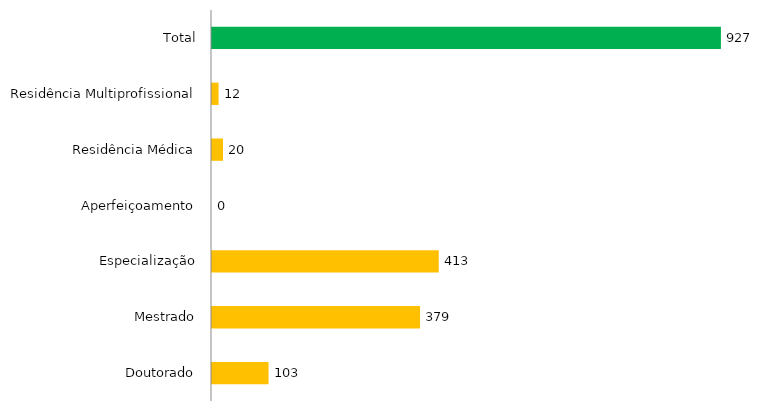
| Category | Pós - Gradução UFGD |
|---|---|
| Doutorado | 103 |
| Mestrado | 379 |
| Especialização | 413 |
| Aperfeiçoamento | 0 |
| Residência Médica | 20 |
| Residência Multiprofissional | 12 |
| Total | 927 |